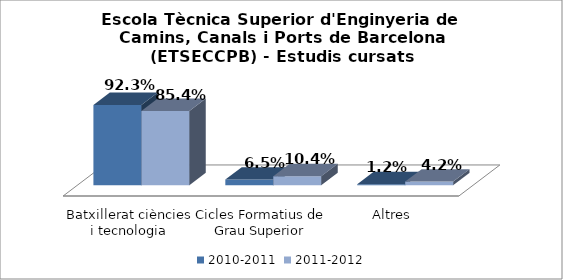
| Category | 2010-2011 | 2011-2012 |
|---|---|---|
| Batxillerat ciències i tecnologia | 0.923 | 0.854 |
| Cicles Formatius de Grau Superior | 0.065 | 0.104 |
| Altres | 0.012 | 0.042 |